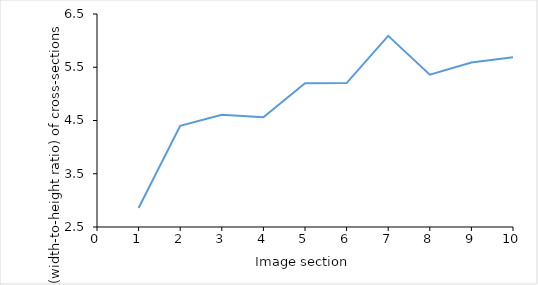
| Category | Series 0 |
|---|---|
| 1.0 | 2.858 |
| 2.0 | 4.401 |
| 3.0 | 4.608 |
| 4.0 | 4.56 |
| 5.0 | 5.202 |
| 6.0 | 5.202 |
| 7.0 | 6.089 |
| 8.0 | 5.36 |
| 9.0 | 5.59 |
| 10.0 | 5.687 |